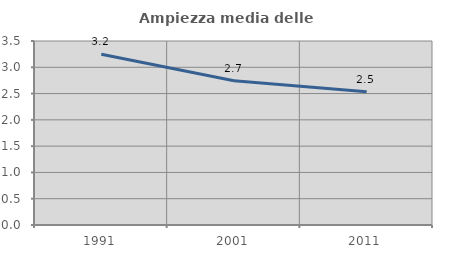
| Category | Ampiezza media delle famiglie |
|---|---|
| 1991.0 | 3.249 |
| 2001.0 | 2.745 |
| 2011.0 | 2.536 |